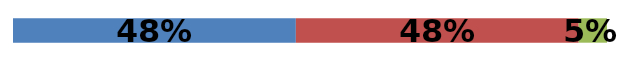
| Category | Series 0 | Series 1 | Series 2 |
|---|---|---|---|
| 0 | 0.476 | 0.476 | 0.048 |